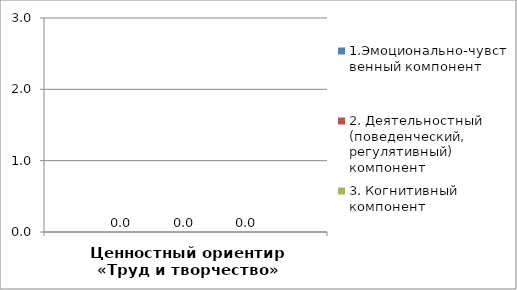
| Category | 1.Эмоционально-чувственный компонент | 2. Деятельностный (поведенческий, регулятивный) компонент | 3. Когнитивный компонент |
|---|---|---|---|
| Ценностный ориентир «Труд и творчество» | 0 | 0 | 0 |